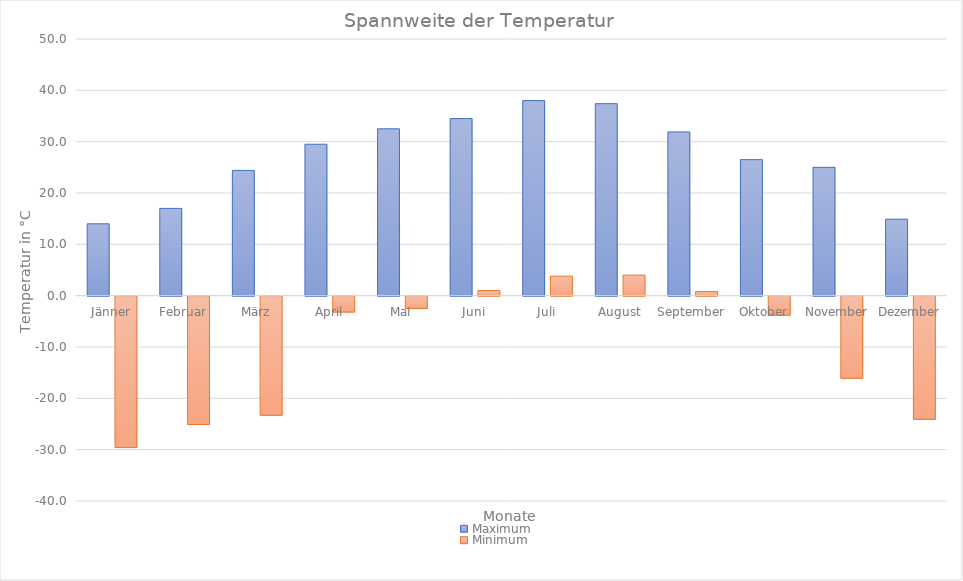
| Category | Maximum | Minimum |
|---|---|---|
| Jänner | 14 | -29.5 |
| Februar | 17 | -25 |
| März | 24.4 | -23.2 |
| April | 29.5 | -3.1 |
| Mai | 32.5 | -2.4 |
| Juni | 34.5 | 1 |
| Juli | 38 | 3.8 |
| August | 37.4 | 4 |
| September | 31.9 | 0.8 |
| Oktober | 26.5 | -3.7 |
| November | 25 | -16 |
| Dezember | 14.9 | -24 |